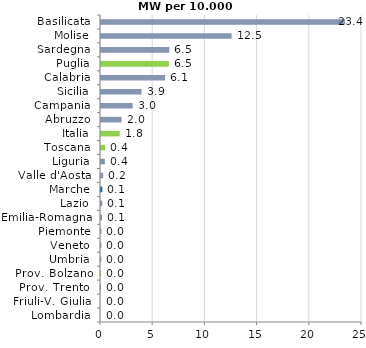
| Category | Series 0 |
|---|---|
| Lombardia | 0 |
| Friuli-V. Giulia | 0 |
| Prov. Trento  | 0.002 |
| Prov. Bolzano | 0.006 |
| Umbria | 0.024 |
| Veneto | 0.027 |
| Piemonte | 0.044 |
| Emilia-Romagna | 0.101 |
| Lazio | 0.124 |
| Marche | 0.129 |
| Valle d'Aosta | 0.208 |
| Liguria | 0.371 |
| Toscana | 0.388 |
| Italia | 1.797 |
| Abruzzo | 1.971 |
| Campania | 3.037 |
| Sicilia | 3.884 |
| Calabria | 6.142 |
| Puglia | 6.504 |
| Sardegna | 6.546 |
| Molise | 12.508 |
| Basilicata | 23.371 |